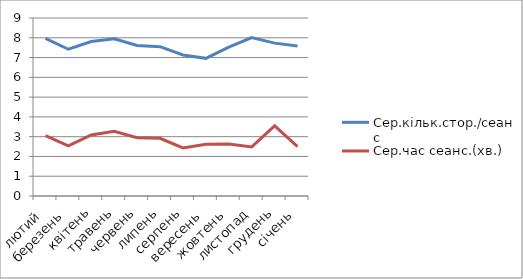
| Category | Сер.кільк.стор./сеанс | Сер.час сеанс.(хв.) |
|---|---|---|
| лютий | 7.97 | 3.05 |
| березень | 7.42 | 2.533 |
| квітень | 7.81 | 3.083 |
| травень | 7.95 | 3.267 |
| червень | 7.61 | 2.95 |
| липень | 7.55 | 2.917 |
| серпень | 7.13 | 2.433 |
| вересень | 6.96 | 2.617 |
| жовтень | 7.53 | 2.633 |
| листопад | 8.01 | 2.483 |
| грудень | 7.73 | 3.55 |
| січень | 7.58 | 2.5 |